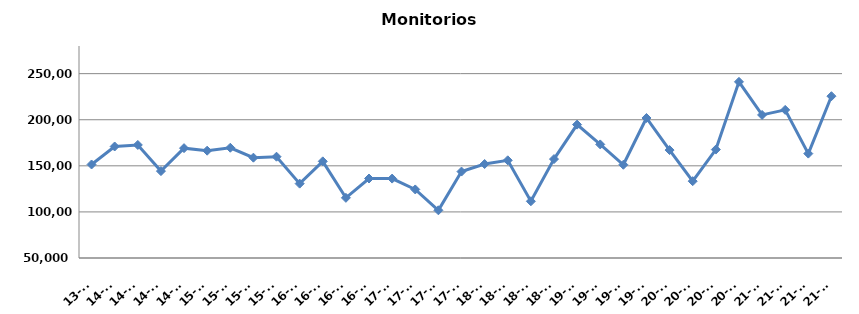
| Category | Monitorios ingresados |
|---|---|
| 13-T4 | 151448 |
| 14-T1 | 170973 |
| 14-T2 | 172648 |
| 14-T3 | 144262 |
| 14-T4 | 169174 |
| 15-T1 | 166433 |
| 15-T2 | 169612 |
| 15-T3 | 158859 |
| 15-T4 | 159890 |
| 16-T1 | 130680 |
| 16-T2 | 154860 |
| 16-T3 | 115269 |
| 16-T4 | 136245 |
| 17-T1 | 136155 |
| 17-T2 | 124382 |
| 17-T3 | 101751 |
| 17-T4 | 143788 |
| 18-T1 | 151974 |
| 18-T2 | 155991 |
| 18-T3 | 111544 |
| 18-T4 | 157337 |
| 19-T1 | 194715 |
| 19-T2 | 173225 |
| 19-T3 | 151156 |
| 19-T4 | 201895 |
| 20-T1 | 167095 |
| 20-T2 | 133351 |
| 20-T3 | 167630 |
| 20-T4 | 241119 |
| 21-T1 | 205212 |
| 21-T2 | 210679 |
| 21-T3 | 163259 |
| 21-T4 | 225536 |